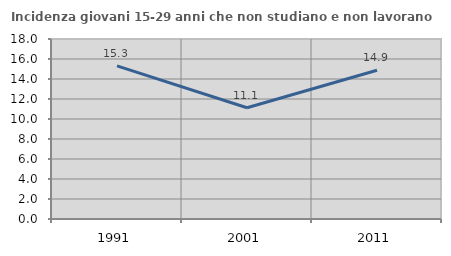
| Category | Incidenza giovani 15-29 anni che non studiano e non lavorano  |
|---|---|
| 1991.0 | 15.306 |
| 2001.0 | 11.122 |
| 2011.0 | 14.874 |